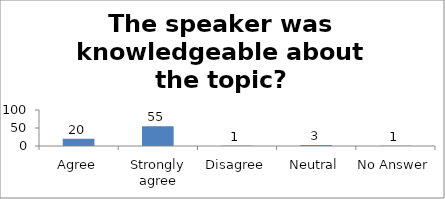
| Category | The speaker was knowledgeable about the topic? |
|---|---|
| Agree | 20 |
| Strongly agree | 55 |
| Disagree | 1 |
| Neutral | 3 |
| No Answer | 1 |